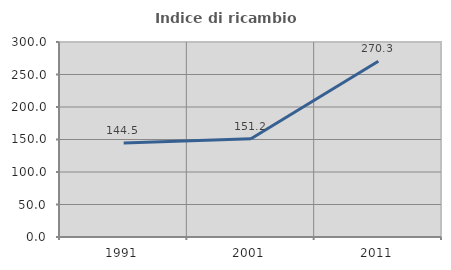
| Category | Indice di ricambio occupazionale  |
|---|---|
| 1991.0 | 144.534 |
| 2001.0 | 151.208 |
| 2011.0 | 270.29 |